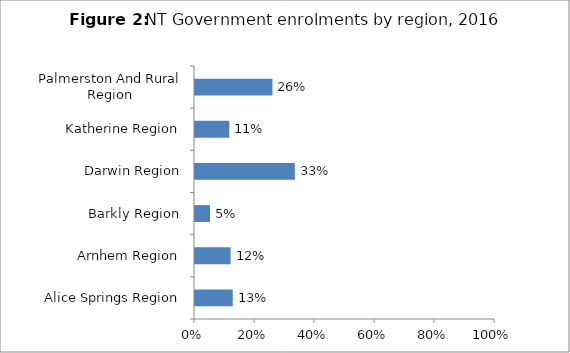
| Category | % |
|---|---|
| Alice Springs Region | 0.126 |
| Arnhem Region | 0.119 |
| Barkly Region | 0.05 |
| Darwin Region | 0.333 |
| Katherine Region | 0.114 |
| Palmerston And Rural Region | 0.258 |